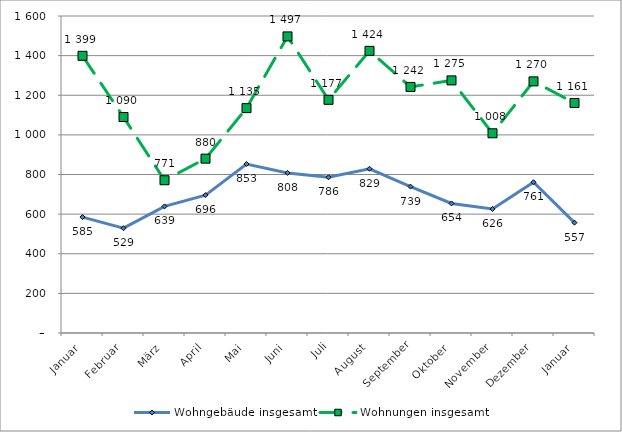
| Category | Wohngebäude insgesamt | Wohnungen insgesamt |
|---|---|---|
| Januar | 585 | 1399 |
| Februar | 529 | 1090 |
| März | 639 | 771 |
| April | 696 | 880 |
| Mai | 853 | 1135 |
| Juni | 808 | 1497 |
| Juli | 786 | 1177 |
| August | 829 | 1424 |
| September | 739 | 1242 |
| Oktober | 654 | 1275 |
| November | 626 | 1008 |
| Dezember | 761 | 1270 |
| Januar | 557 | 1161 |